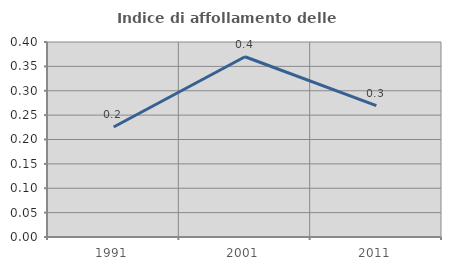
| Category | Indice di affollamento delle abitazioni  |
|---|---|
| 1991.0 | 0.226 |
| 2001.0 | 0.37 |
| 2011.0 | 0.27 |